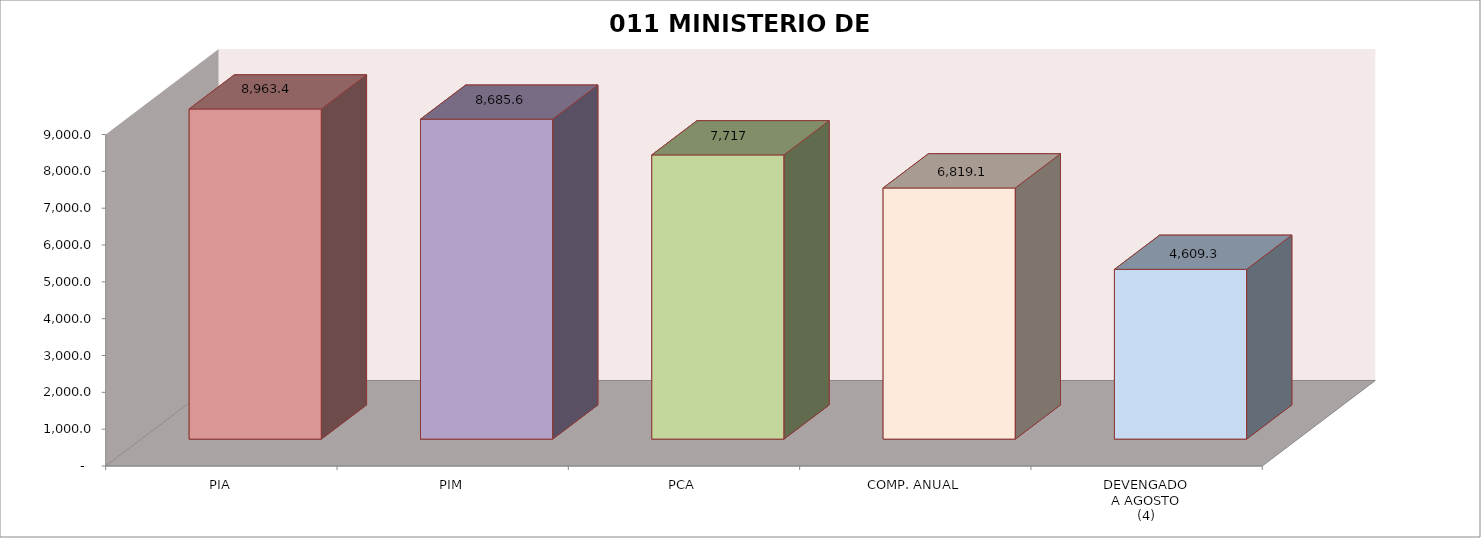
| Category | 011 MINISTERIO DE SALUD |
|---|---|
| PIA | 8963.39 |
| PIM | 8685.576 |
| PCA | 7716.66 |
| COMP. ANUAL | 6819.111 |
| DEVENGADO
A AGOSTO
(4) | 4609.253 |